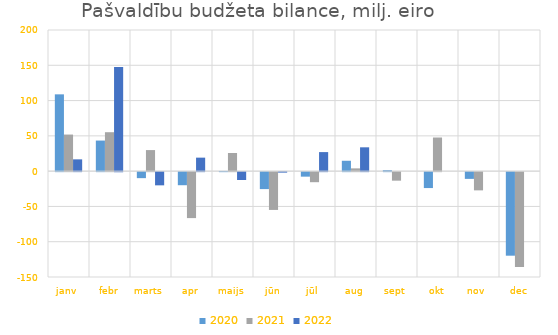
| Category | 2020 | 2021 | 2022 |
|---|---|---|---|
| janv | 108823.125 | 51841.777 | 16703.923 |
| febr | 43336.074 | 55170.117 | 147501.748 |
| marts | -8510.199 | 29854.421 | -18692.108 |
| apr | -18528 | -65110.731 | 19123.02 |
| maijs | 267.19 | 25695.562 | -11153.489 |
| jūn | -24020.19 | -53546.319 | -682.628 |
| jūl | -6388.533 | -14251.375 | 26988.29 |
| aug | 14711.699 | 3925.548 | 33769.918 |
| sept | 1399.66 | -12077.429 | 0 |
| okt | -22549.866 | 47662.114 | 0 |
| nov | -9553.519 | -25816.685 | 0 |
| dec | -118383.812 | -134394.788 | 0 |